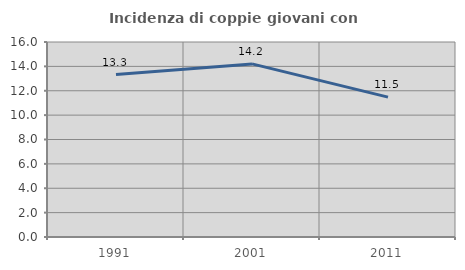
| Category | Incidenza di coppie giovani con figli |
|---|---|
| 1991.0 | 13.333 |
| 2001.0 | 14.205 |
| 2011.0 | 11.475 |